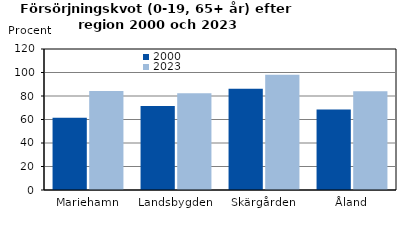
| Category | 2000 | 2023 |
|---|---|---|
| Mariehamn | 61.428 | 84.246 |
| Landsbygden | 71.595 | 82.308 |
| Skärgården | 86.201 | 98.064 |
| Åland | 68.482 | 84.037 |